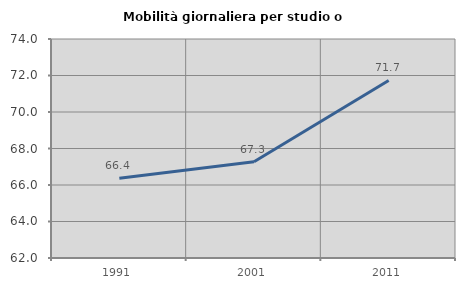
| Category | Mobilità giornaliera per studio o lavoro |
|---|---|
| 1991.0 | 66.366 |
| 2001.0 | 67.278 |
| 2011.0 | 71.729 |